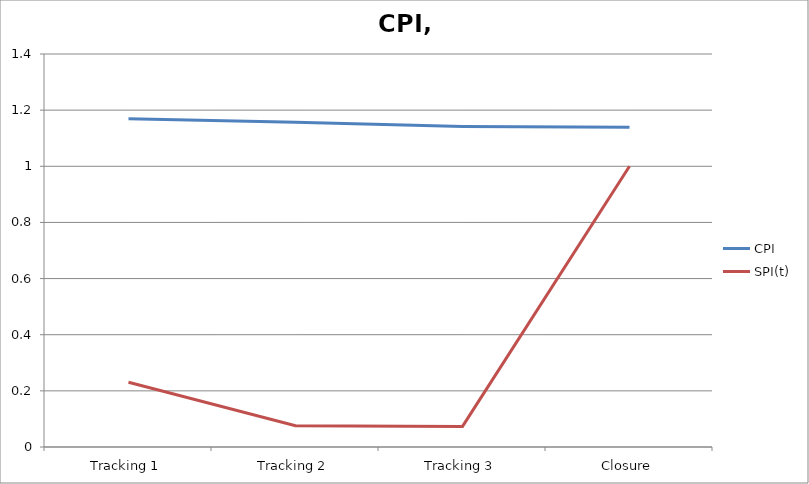
| Category | CPI | SPI(t) |
|---|---|---|
| Tracking 1 | 1.169 | 0.231 |
| Tracking 2 | 1.157 | 0.076 |
| Tracking 3 | 1.142 | 0.073 |
| Closure | 1.139 | 1 |